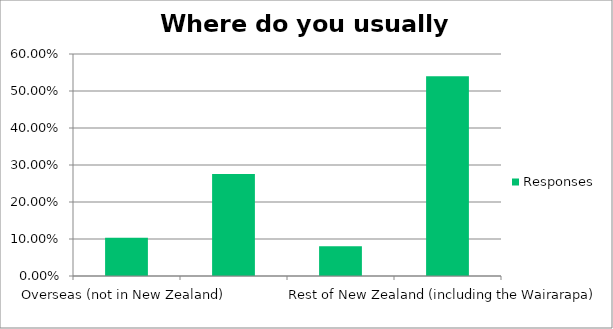
| Category | Responses |
|---|---|
| Overseas (not in New Zealand) | 0.103 |
| Wellington City | 0.276 |
| Welllington Region (Kapiti, Lower Hutt, Upper Hutt, Porirua) | 0.08 |
| Rest of New Zealand (including the Wairarapa) | 0.54 |